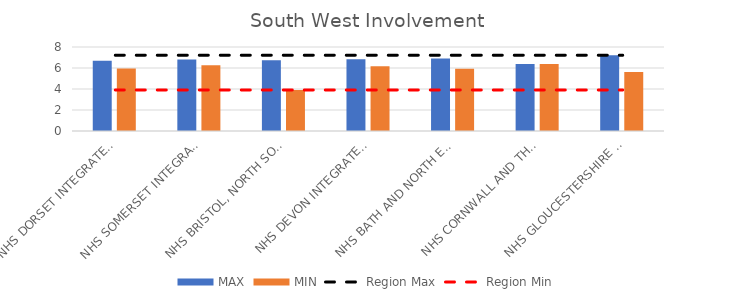
| Category | MAX | MIN |
|---|---|---|
| NHS DORSET INTEGRATED CARE BOARD | 6.687 | 5.949 |
| NHS SOMERSET INTEGRATED CARE BOARD | 6.817 | 6.272 |
| NHS BRISTOL, NORTH SOMERSET AND SOUTH GLOUCESTERSHIRE INTEGRATED CARE BOARD | 6.742 | 3.907 |
| NHS DEVON INTEGRATED CARE BOARD | 6.824 | 6.156 |
| NHS BATH AND NORTH EAST SOMERSET, SWINDON AND WILTSHIRE INTEGRATED CARE BOARD | 6.906 | 5.938 |
| NHS CORNWALL AND THE ISLES OF SCILLY INTEGRATED CARE BOARD | 6.379 | 6.379 |
| NHS GLOUCESTERSHIRE INTEGRATED CARE BOARD | 7.219 | 5.617 |